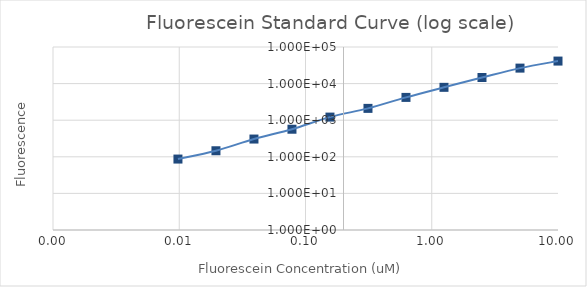
| Category | Series 1 |
|---|---|
| 10.0 | 41252 |
| 5.0 | 26490 |
| 2.5 | 14674 |
| 1.25 | 7907 |
| 0.625 | 4196.75 |
| 0.3125 | 2104.75 |
| 0.15625 | 1215.5 |
| 0.078125 | 566.75 |
| 0.0390625 | 305.5 |
| 0.01953125 | 146.25 |
| 0.009765625 | 86.75 |